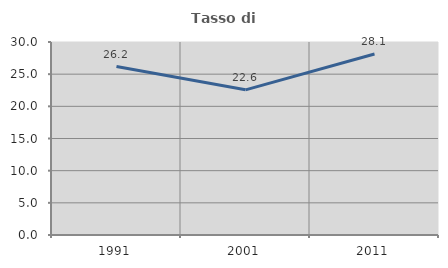
| Category | Tasso di occupazione   |
|---|---|
| 1991.0 | 26.188 |
| 2001.0 | 22.564 |
| 2011.0 | 28.129 |